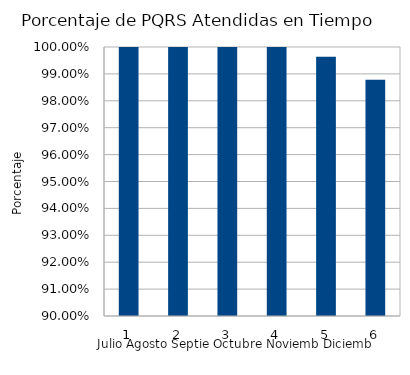
| Category | % PQRS ATENDIDAS EN TIEMPO |
|---|---|
| 0 | 1 |
| 1 | 1 |
| 2 | 1 |
| 3 | 1 |
| 4 | 0.996 |
| 5 | 0.988 |